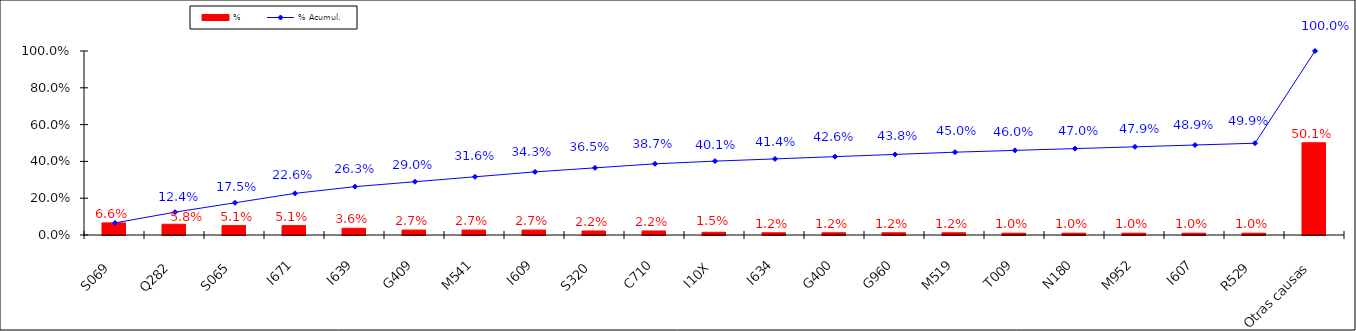
| Category | % |
|---|---|
| S069 | 0.066 |
| Q282 | 0.058 |
| S065 | 0.051 |
| I671 | 0.051 |
| I639 | 0.036 |
| G409 | 0.027 |
| M541 | 0.027 |
| I609 | 0.027 |
| S320 | 0.022 |
| C710 | 0.022 |
| I10X | 0.015 |
| I634 | 0.012 |
| G400 | 0.012 |
| G960 | 0.012 |
| M519 | 0.012 |
| T009 | 0.01 |
| N180 | 0.01 |
| M952 | 0.01 |
| I607 | 0.01 |
| R529 | 0.01 |
| Otras causas | 0.501 |